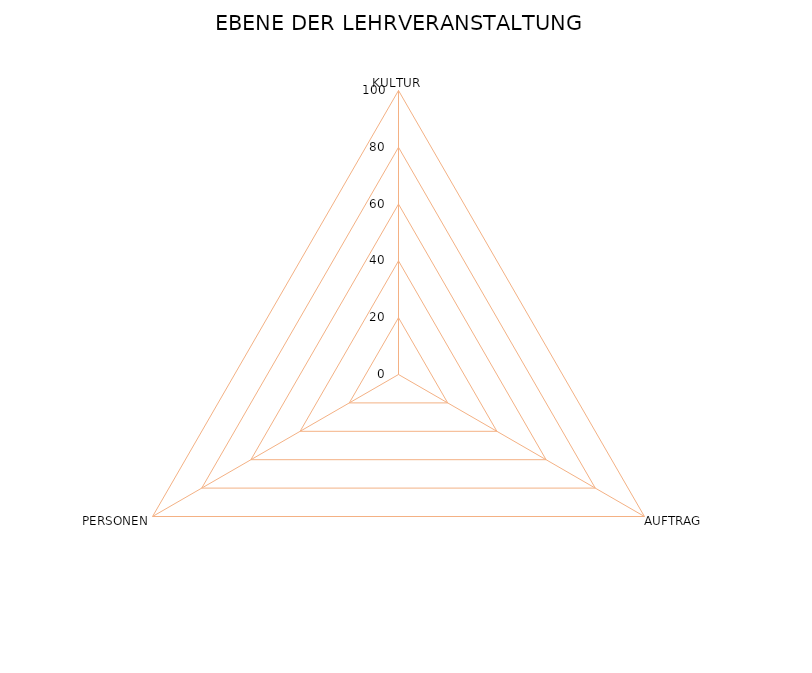
| Category | Series 0 |
|---|---|
| KULTUR | 0 |
| AUFTRAG | 0 |
| PERSONEN | 0 |